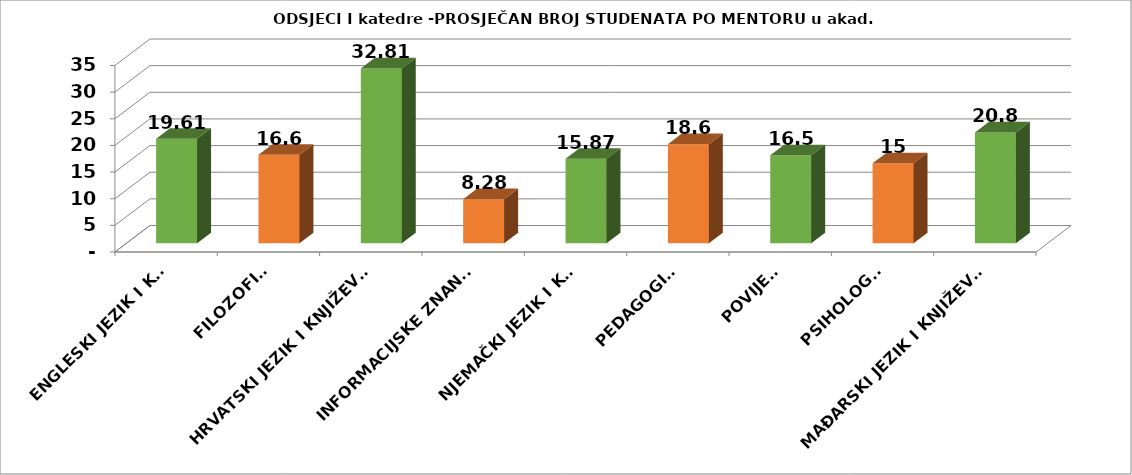
| Category | Series 0 |
|---|---|
| ENGLESKI JEZIK I KNJIŽ. | 19.61 |
| FILOZOFIJA  | 16.6 |
| HRVATSKI JEZIK I KNJIŽEVNOST | 32.81 |
| INFORMACIJSKE ZNANOSTI  | 8.28 |
| NJEMAČKI JEZIK I KNJIŽ. | 15.87 |
| PEDAGOGIJA  | 18.6 |
| POVIJEST  | 16.5 |
| PSIHOLOGIJA | 15 |
| MAĐARSKI JEZIK I KNJIŽEVNOST | 20.8 |